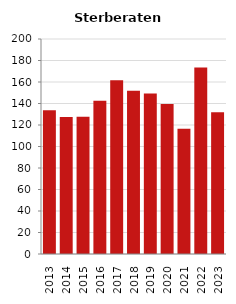
| Category | Sterberate der Bevölkerung ab 80 Jahre (auf Tsd.) |
|---|---|
| 2013.0 | 133.676 |
| 2014.0 | 127.451 |
| 2015.0 | 127.764 |
| 2016.0 | 142.512 |
| 2017.0 | 161.593 |
| 2018.0 | 151.927 |
| 2019.0 | 149.22 |
| 2020.0 | 139.535 |
| 2021.0 | 116.564 |
| 2022.0 | 173.554 |
| 2023.0 | 131.959 |